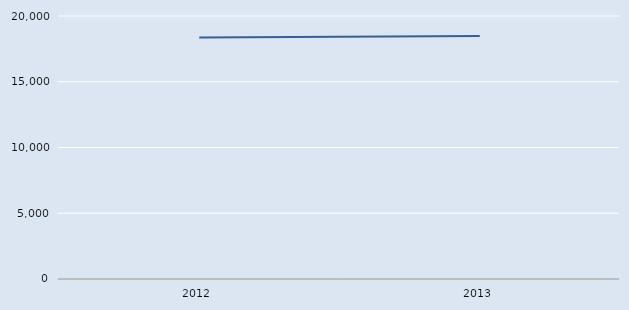
| Category | Series 0 |
|---|---|
| 2012.0 | 18370 |
| 2013.0 | 18480 |